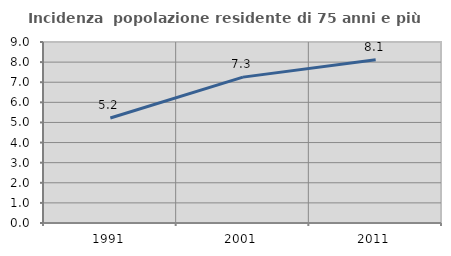
| Category | Incidenza  popolazione residente di 75 anni e più |
|---|---|
| 1991.0 | 5.223 |
| 2001.0 | 7.253 |
| 2011.0 | 8.116 |